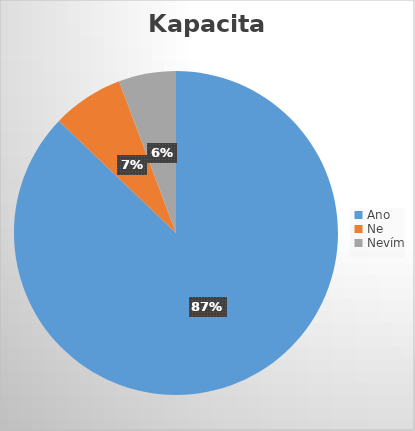
| Category | Series 0 |
|---|---|
| Ano | 61 |
| Ne | 5 |
| Nevím | 4 |